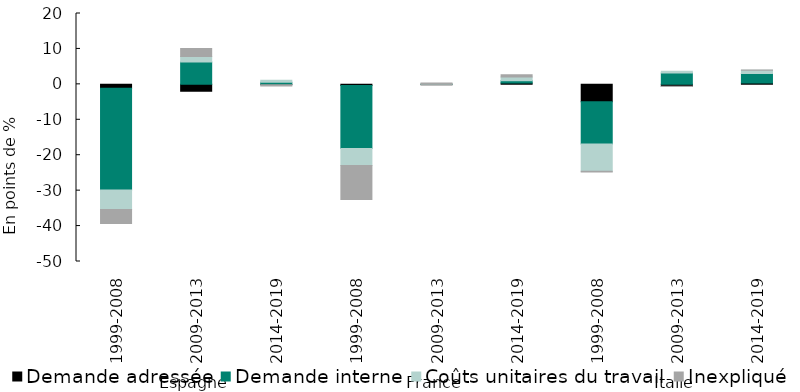
| Category | Demande adressée | Demande interne | Coûts unitaires du travail | Inexpliqué |
|---|---|---|---|---|
| 0 | -1.1 | -28.719 | -5.526 | -3.898 |
| 1 | -1.95 | 6.343 | 1.532 | 2.252 |
| 2 | -0.077 | 0.607 | 0.533 | -0.358 |
| 3 | -0.313 | -17.788 | -4.805 | -9.619 |
| 4 | -0.13 | 0.039 | 0.018 | 0.31 |
| 5 | 0.359 | 0.631 | 1.088 | 0.65 |
| 6 | -4.909 | -11.933 | -7.685 | -0.199 |
| 7 | -0.532 | 3.205 | 0.466 | -0.08 |
| 8 | 0.4 | 2.641 | 0.937 | 0.059 |